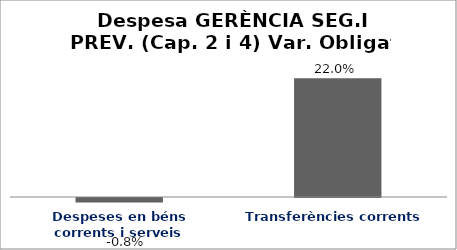
| Category | Series 0 |
|---|---|
| Despeses en béns corrents i serveis | -0.008 |
| Transferències corrents | 0.22 |